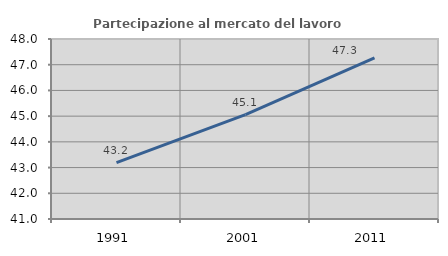
| Category | Partecipazione al mercato del lavoro  femminile |
|---|---|
| 1991.0 | 43.193 |
| 2001.0 | 45.057 |
| 2011.0 | 47.269 |